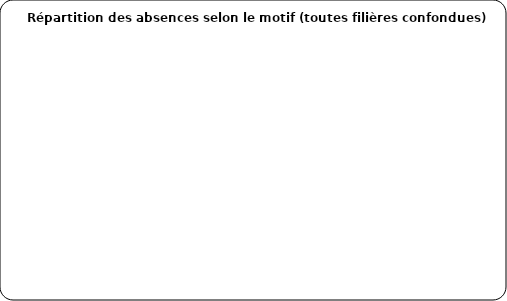
| Category | Volume |
|---|---|
| Maladie | 0 |
| AT / MP | 0 |
| Maternité | 0 |
| Paternité | 0 |
| CPE | 0 |
| Formation | 0 |